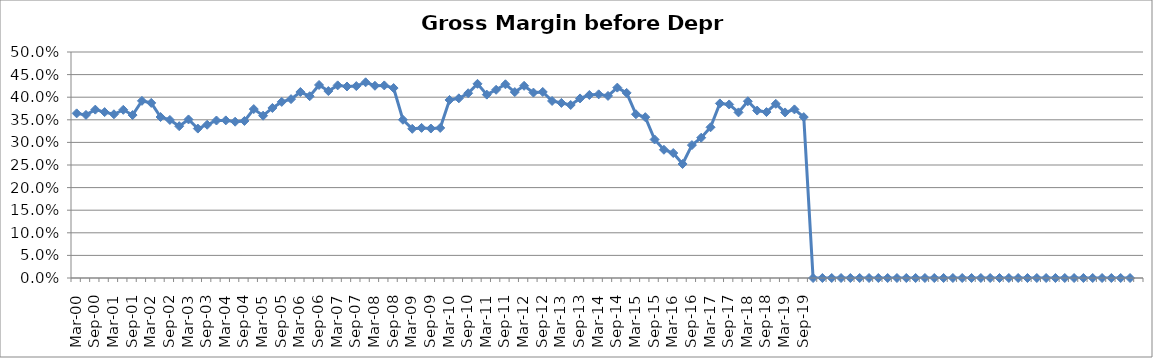
| Category | Gross Margin (before depr) % |
|---|---|
| Mar-00 | 0.364 |
| Jun-00 | 0.361 |
| Sep-00 | 0.372 |
| Dec-00 | 0.367 |
| Mar-01 | 0.362 |
| Jun-01 | 0.372 |
| Sep-01 | 0.36 |
| Dec-01 | 0.392 |
| Mar-02 | 0.387 |
| Jun-02 | 0.356 |
| Sep-02 | 0.35 |
| Dec-02 | 0.336 |
| Mar-03 | 0.351 |
| Jun-03 | 0.331 |
| Sep-03 | 0.339 |
| Dec-03 | 0.348 |
| Mar-04 | 0.349 |
| Jun-04 | 0.346 |
| Sep-04 | 0.347 |
| Dec-04 | 0.374 |
| Mar-05 | 0.359 |
| Jun-05 | 0.376 |
| Sep-05 | 0.39 |
| Dec-05 | 0.396 |
| Mar-06 | 0.411 |
| Jun-06 | 0.402 |
| Sep-06 | 0.427 |
| Dec-06 | 0.414 |
| Mar-07 | 0.426 |
| Jun-07 | 0.424 |
| Sep-07 | 0.425 |
| Dec-07 | 0.433 |
| Mar-08 | 0.425 |
| Jun-08 | 0.426 |
| Sep-08 | 0.42 |
| Dec-08 | 0.35 |
| Mar-09 | 0.33 |
| Jun-09 | 0.332 |
| Sep-09 | 0.331 |
| Dec-09 | 0.332 |
| Mar-10 | 0.394 |
| Jun-10 | 0.397 |
| Sep-10 | 0.409 |
| Dec-10 | 0.43 |
| Mar-11 | 0.406 |
| Jun-11 | 0.416 |
| Sep-11 | 0.429 |
| Dec-11 | 0.411 |
| Mar-12 | 0.425 |
| Jun-12 | 0.41 |
| Sep-12 | 0.412 |
| Dec-12 | 0.392 |
| Mar-13 | 0.387 |
| Jun-13 | 0.383 |
| Sep-13 | 0.397 |
| Dec-13 | 0.405 |
| Mar-14 | 0.406 |
| Jun-14 | 0.403 |
| Sep-14 | 0.421 |
| Dec-14 | 0.41 |
| Mar-15 | 0.362 |
| Jun-15 | 0.356 |
| Sep-15 | 0.306 |
| Dec-15 | 0.284 |
| Mar-16 | 0.276 |
| Jun-16 | 0.252 |
| Sep-16 | 0.294 |
| Dec-16 | 0.31 |
| Mar-17 | 0.333 |
| Jun-17 | 0.386 |
| Sep-17 | 0.384 |
| Dec-17 | 0.366 |
| Mar-18 | 0.391 |
| Jun-18 | 0.37 |
| Sep-18 | 0.367 |
| Dec-18 | 0.385 |
| Mar-19 | 0.366 |
| Jun-19 | 0.373 |
| Sep-19 | 0.356 |